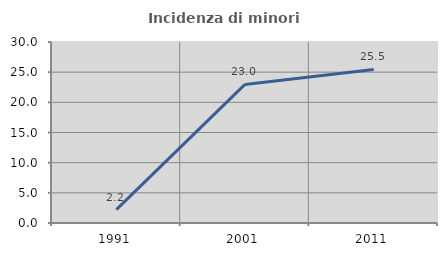
| Category | Incidenza di minori stranieri |
|---|---|
| 1991.0 | 2.222 |
| 2001.0 | 22.973 |
| 2011.0 | 25.455 |